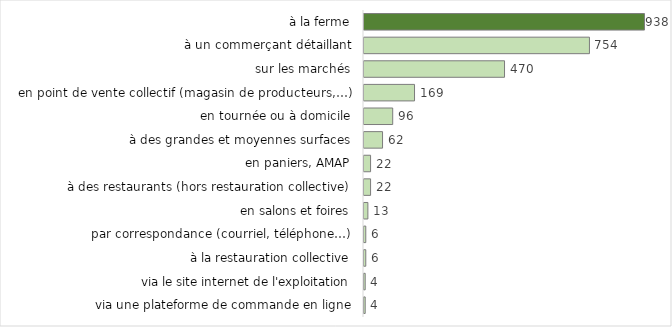
| Category | Effectif |
|---|---|
|   à la ferme | 938 |
|   à un commerçant détaillant | 754 |
|   sur les marchés | 470 |
|   en point de vente collectif (magasin de producteurs,…) | 169 |
|   en tournée ou à domicile | 96 |
|   à des grandes et moyennes surfaces | 62 |
|   en paniers, AMAP | 22 |
|   à des restaurants (hors restauration collective) | 22 |
|   en salons et foires | 13 |
|   par correspondance (courriel, téléphone…) | 6 |
|   à la restauration collective | 6 |
|   via le site internet de l'exploitation | 4 |
|   via une plateforme de commande en ligne | 4 |